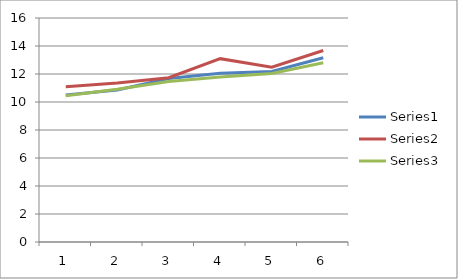
| Category | Series 0 | Series 1 | Series 2 |
|---|---|---|---|
| 0 | 10.5 | 11.081 | 10.454 |
| 1 | 10.852 | 11.353 | 10.909 |
| 2 | 11.677 | 11.735 | 11.469 |
| 3 | 12.047 | 13.096 | 11.786 |
| 4 | 12.174 | 12.485 | 12.038 |
| 5 | 13.163 | 13.677 | 12.797 |